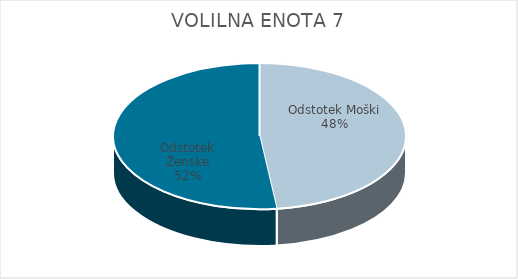
| Category | VOLILNA ENOTA 7 | #REF! | Slovenija skupaj |
|---|---|---|---|
| Odstotek Moški | 32.21 |  | 33.67 |
| Odstotek Ženske | 34.71 |  | 35.97 |